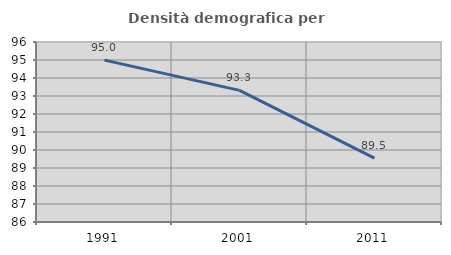
| Category | Densità demografica |
|---|---|
| 1991.0 | 94.995 |
| 2001.0 | 93.313 |
| 2011.0 | 89.549 |